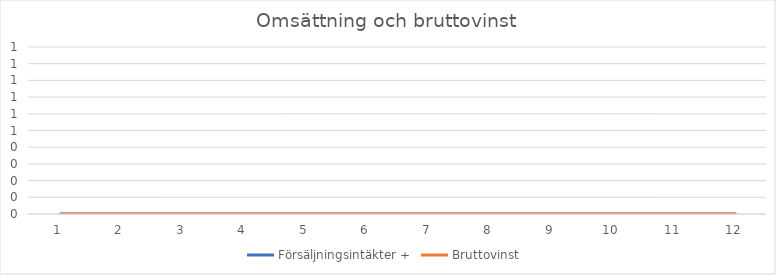
| Category | Försäljningsintäkter | Bruttovinst |
|---|---|---|
| 0 | 0 | 0 |
| 1 | 0 | 0 |
| 2 | 0 | 0 |
| 3 | 0 | 0 |
| 4 | 0 | 0 |
| 5 | 0 | 0 |
| 6 | 0 | 0 |
| 7 | 0 | 0 |
| 8 | 0 | 0 |
| 9 | 0 | 0 |
| 10 | 0 | 0 |
| 11 | 0 | 0 |